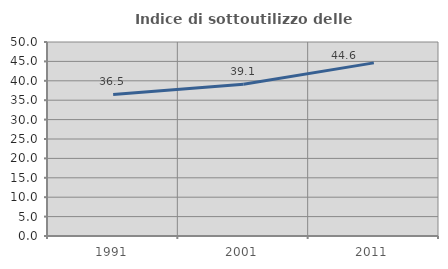
| Category | Indice di sottoutilizzo delle abitazioni  |
|---|---|
| 1991.0 | 36.486 |
| 2001.0 | 39.13 |
| 2011.0 | 44.615 |